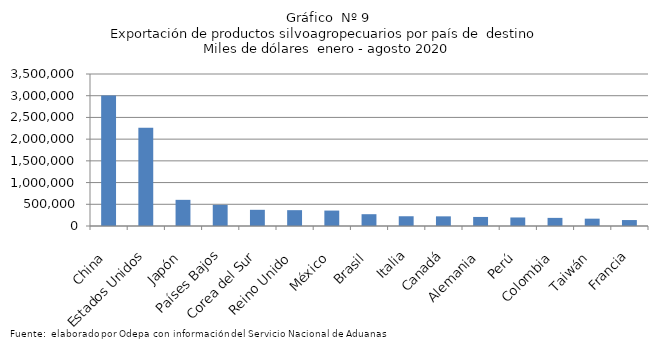
| Category | Series 0 |
|---|---|
| China | 3004002.428 |
| Estados Unidos | 2264585.645 |
| Japón | 602316.377 |
| Países Bajos | 486213.225 |
| Corea del Sur | 372808.997 |
| Reino Unido | 364634.88 |
| México | 355378.031 |
| Brasil | 271854.463 |
| Italia | 224461.979 |
| Canadá | 222314.299 |
| Alemania | 208419.332 |
| Perú | 196530.137 |
| Colombia | 186974.073 |
| Taiwán | 168823.04 |
| Francia | 137051.455 |